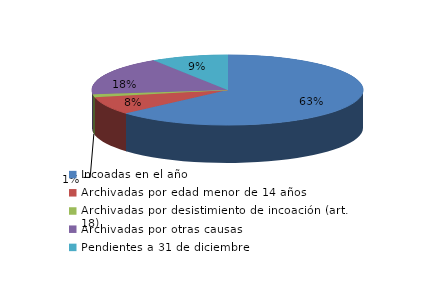
| Category | Series 0 |
|---|---|
| Incoadas en el año | 132 |
| Archivadas por edad menor de 14 años | 17 |
| Archivadas por desistimiento de incoación (art. 18) | 3 |
| Archivadas por otras causas | 37 |
| Pendientes a 31 de diciembre | 19 |